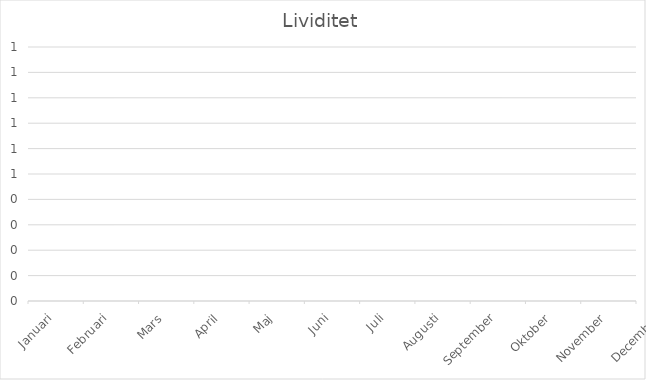
| Category | Series 0 |
|---|---|
| Januari | 0 |
| Februari | 0 |
| Mars | 0 |
| April | 0 |
| Maj | 0 |
| Juni | 0 |
| Juli | 0 |
| Augusti | 0 |
| September | 0 |
| Oktober | 0 |
| November | 0 |
| December | 0 |